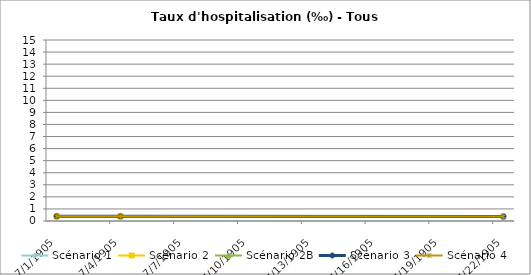
| Category | Scénario 1 | Scénario 2 | Scénario 2B | Scénario 3 | Scénario 4 |
|---|---|---|---|---|---|
| 2009.0 | 0.392 | 0.392 | 0.392 | 0.392 | 0.392 |
| 2012.0 | 0.388 | 0.388 | 0.388 | 0.388 | 0.388 |
| 2030.0 | 0.376 | 0.38 | 0.376 | 0.376 | 0.376 |